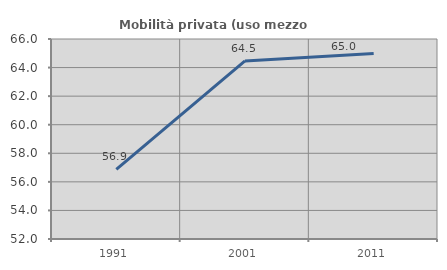
| Category | Mobilità privata (uso mezzo privato) |
|---|---|
| 1991.0 | 56.88 |
| 2001.0 | 64.463 |
| 2011.0 | 64.991 |